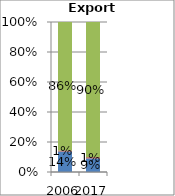
| Category | Agriculture | Fuels and mining | Manufacturing |
|---|---|---|---|
| 2006.0 | 0.137 | 0.006 | 0.857 |
| 2017.0 | 0.091 | 0.008 | 0.901 |